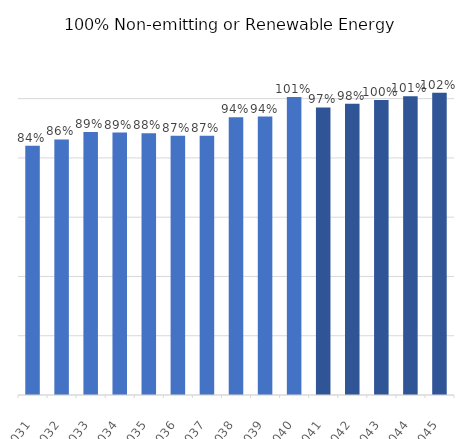
| Category | Series 0 |
|---|---|
| 2031.0 | 0.841 |
| 2032.0 | 0.862 |
| 2033.0 | 0.888 |
| 2034.0 | 0.885 |
| 2035.0 | 0.883 |
| 2036.0 | 0.875 |
| 2037.0 | 0.875 |
| 2038.0 | 0.937 |
| 2039.0 | 0.94 |
| 2040.0 | 1.006 |
| 2041.0 | 0.97 |
| 2042.0 | 0.983 |
| 2043.0 | 0.995 |
| 2044.0 | 1.008 |
| 2045.0 | 1.02 |